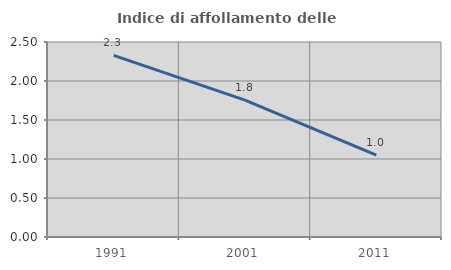
| Category | Indice di affollamento delle abitazioni  |
|---|---|
| 1991.0 | 2.328 |
| 2001.0 | 1.754 |
| 2011.0 | 1.05 |